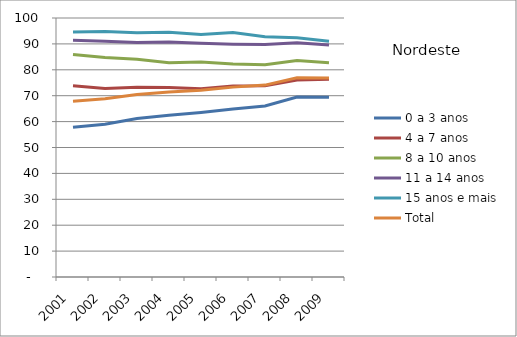
| Category | 0 a 3 anos | 4 a 7 anos | 8 a 10 anos | 11 a 14 anos | 15 anos e mais | Total |
|---|---|---|---|---|---|---|
| 2001.0 | 57.8 | 73.83 | 85.93 | 91.45 | 94.56 | 67.87 |
| 2002.0 | 59.02 | 72.82 | 84.77 | 90.99 | 94.78 | 68.79 |
| 2003.0 | 61.21 | 73.24 | 84.08 | 90.58 | 94.32 | 70.44 |
| 2004.0 | 62.44 | 73.19 | 82.71 | 90.7 | 94.48 | 71.39 |
| 2005.0 | 63.53 | 72.71 | 82.98 | 90.24 | 93.62 | 72.07 |
| 2006.0 | 64.85 | 73.75 | 82.21 | 89.88 | 94.37 | 73.31 |
| 2007.0 | 66.02 | 73.84 | 81.92 | 89.76 | 92.73 | 74.09 |
| 2008.0 | 69.46 | 76.08 | 83.6 | 90.45 | 92.39 | 76.9 |
| 2009.0 | 69.36 | 76.34 | 82.75 | 89.54 | 91.06 | 76.84 |